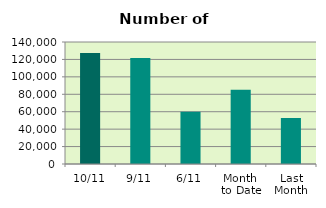
| Category | Series 0 |
|---|---|
| 10/11 | 127278 |
| 9/11 | 121672 |
| 6/11 | 59986 |
| Month 
to Date | 85170.857 |
| Last
Month | 52845 |